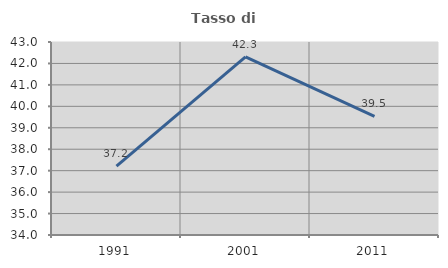
| Category | Tasso di occupazione   |
|---|---|
| 1991.0 | 37.209 |
| 2001.0 | 42.308 |
| 2011.0 | 39.535 |